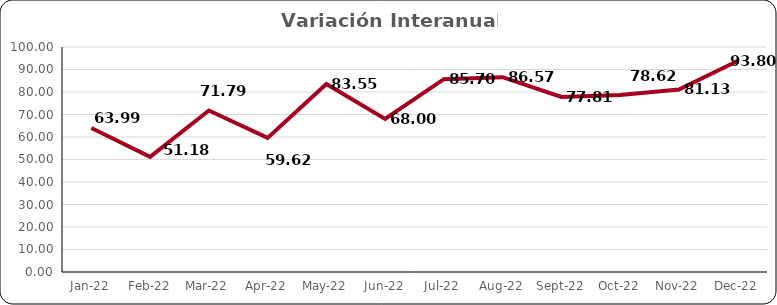
| Category | Variación
Interanual % |
|---|---|
| 2022-01-01 | 63.99 |
| 2022-02-01 | 51.18 |
| 2022-03-01 | 71.79 |
| 2022-04-01 | 59.62 |
| 2022-05-01 | 83.55 |
| 2022-06-01 | 68 |
| 2022-07-01 | 85.7 |
| 2022-08-01 | 86.57 |
| 2022-09-01 | 77.81 |
| 2022-10-01 | 78.62 |
| 2022-11-01 | 81.13 |
| 2022-12-01 | 93.8 |